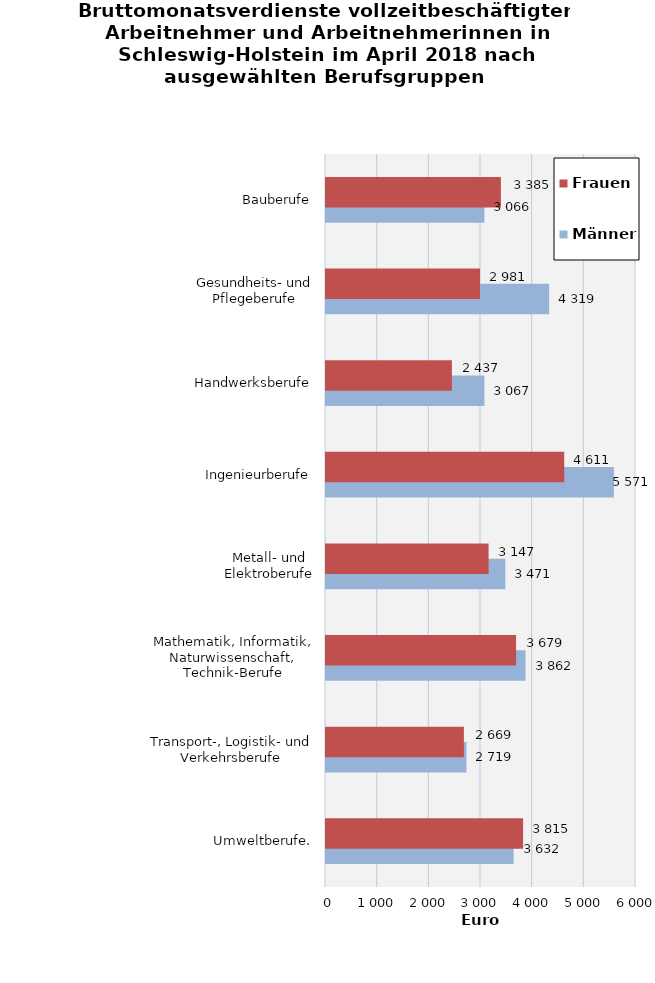
| Category | Männer | Frauen |
|---|---|---|
| Umweltberufe. | 3632 | 3815 |
| Transport-, Logistik- und Verkehrsberufe | 2719 | 2669 |
| Mathematik, Informatik, Naturwissenschaft, Technik-Berufe | 3862 | 3679 |
| Metall- und Elektroberufe | 3471 | 3147 |
| Ingenieurberufe | 5571 | 4611 |
| Handwerksberufe | 3067 | 2437 |
| Gesundheits- und Pflegeberufe | 4319 | 2981 |
| Bauberufe | 3066 | 3385 |